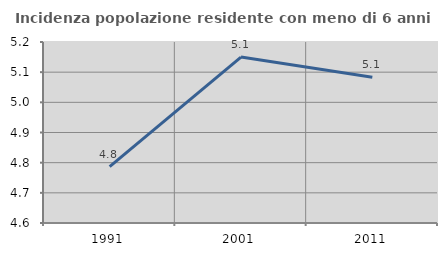
| Category | Incidenza popolazione residente con meno di 6 anni |
|---|---|
| 1991.0 | 4.787 |
| 2001.0 | 5.15 |
| 2011.0 | 5.083 |